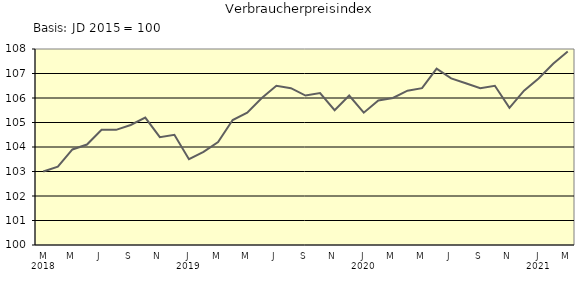
| Category | Series 0 |
|---|---|
| 0 | 103 |
| 1 | 103.2 |
| 2 | 103.9 |
| 3 | 104.1 |
| 4 | 104.7 |
| 5 | 104.7 |
| 6 | 104.9 |
| 7 | 105.2 |
| 8 | 104.4 |
| 9 | 104.5 |
| 10 | 103.5 |
| 11 | 103.8 |
| 12 | 104.2 |
| 13 | 105.1 |
| 14 | 105.4 |
| 15 | 106 |
| 16 | 106.5 |
| 17 | 106.4 |
| 18 | 106.1 |
| 19 | 106.2 |
| 20 | 105.5 |
| 21 | 106.1 |
| 22 | 105.4 |
| 23 | 105.9 |
| 24 | 106 |
| 25 | 106.3 |
| 26 | 106.4 |
| 27 | 107.2 |
| 28 | 106.8 |
| 29 | 106.6 |
| 30 | 106.4 |
| 31 | 106.5 |
| 32 | 105.6 |
| 33 | 106.3 |
| 34 | 106.8 |
| 35 | 107.4 |
| 36 | 107.9 |